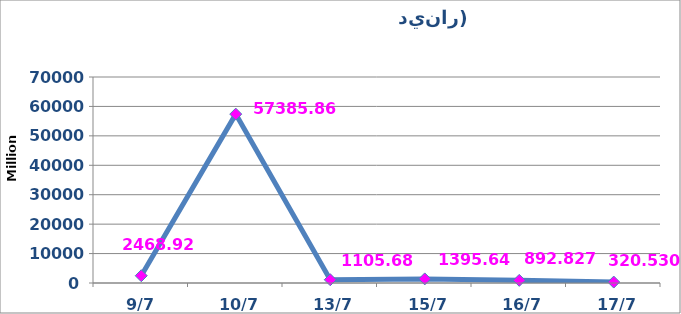
| Category | القيمة المتداولة |
|---|---|
|  9/7 | 2468924407 |
|  10/7 | 57385869081 |
|  13/7 | 1105685303 |
|  15/7 | 1395640096 |
|  16/7 | 892827067 |
|  17/7 | 320529970 |